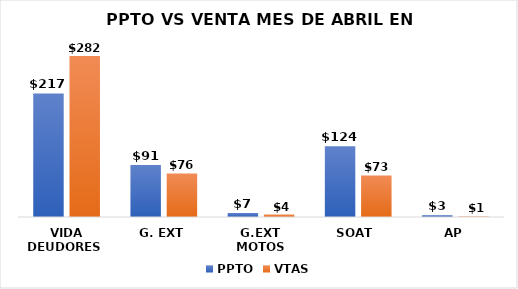
| Category |  PPTO   | VTAS |
|---|---|---|
| VIDA DEUDORES  | 216861857.28 | 282473333 |
| G. EXT | 91212480 | 76433469 |
| G.EXT MOTOS | 7000000 | 4224120 |
| SOAT  | 124000000 | 72962500 |
| AP | 3178572.503 | 983400 |